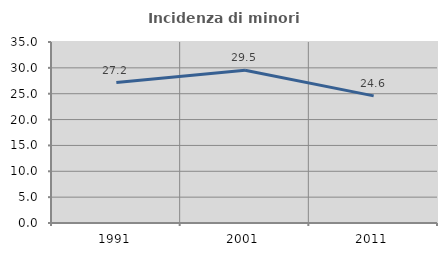
| Category | Incidenza di minori stranieri |
|---|---|
| 1991.0 | 27.16 |
| 2001.0 | 29.524 |
| 2011.0 | 24.586 |